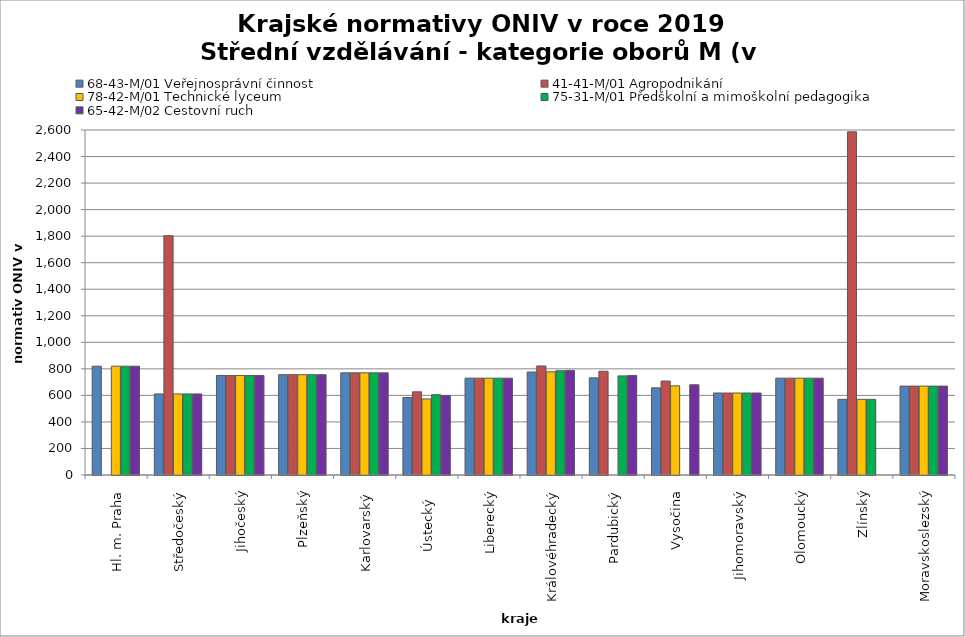
| Category | 68-43-M/01 Veřejnosprávní činnost | 41-41-M/01 Agropodnikání | 78-42-M/01 Technické lyceum | 75-31-M/01 Předškolní a mimoškolní pedagogika | 65-42-M/02 Cestovní ruch |
|---|---|---|---|---|---|
| Hl. m. Praha | 820 | 0 | 820 | 820 | 820 |
| Středočeský | 611 | 1803 | 611 | 611 | 611 |
| Jihočeský | 750 | 750 | 750 | 750 | 750 |
| Plzeňský | 756 | 756 | 756 | 756 | 756 |
| Karlovarský  | 770 | 770 | 770 | 770 | 770 |
| Ústecký   | 584 | 627 | 573 | 605 | 599 |
| Liberecký | 730 | 730 | 730 | 730 | 730 |
| Královéhradecký | 776.2 | 821.9 | 777.8 | 785.5 | 788.4 |
| Pardubický | 732 | 782 | 0 | 747 | 750 |
| Vysočina | 657 | 708 | 672 | 0 | 680 |
| Jihomoravský | 618 | 618 | 618 | 618 | 618 |
| Olomoucký | 730 | 730 | 730 | 730 | 730 |
| Zlínský | 570 | 2586 | 570 | 570 | 0 |
| Moravskoslezský | 670 | 670 | 670 | 670 | 670 |